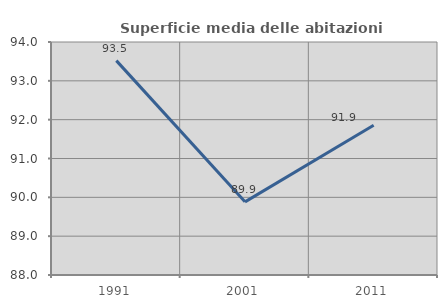
| Category | Superficie media delle abitazioni occupate |
|---|---|
| 1991.0 | 93.521 |
| 2001.0 | 89.883 |
| 2011.0 | 91.857 |